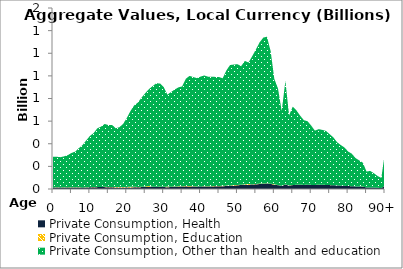
| Category | Private Consumption, Health | Private Consumption, Education | Private Consumption, Other than health and education |
|---|---|---|---|
| 0 | 12.96 | 0.914 | 270.473 |
|  | 13.577 | 1.798 | 269.697 |
| 2 | 13.556 | 0.538 | 267.21 |
| 3 | 13.371 | 1.679 | 273.608 |
| 4 | 13.487 | 0.735 | 284.792 |
| 5 | 13.558 | 2.582 | 302.59 |
| 6 | 12.843 | 2.132 | 314.75 |
| 7 | 12.6 | 2.602 | 345.778 |
| 8 | 12.729 | 1.166 | 374.715 |
| 9 | 13.536 | 1.827 | 414.327 |
| 10 | 14.559 | 1.907 | 452.532 |
| 11 | 15.206 | 2.021 | 476.493 |
| 12 | 16.601 | 1.332 | 518.052 |
| 13 | 16.738 | 1.366 | 533.222 |
| 14 | 16.603 | 2.892 | 555.227 |
| 15 | 15.306 | 2.948 | 547.471 |
| 16 | 14.785 | 2.63 | 549.216 |
| 17 | 13.961 | 3.948 | 519.25 |
| 18 | 14.046 | 3.361 | 528.91 |
| 19 | 14.139 | 3.154 | 557.708 |
| 20 | 14.38 | 3.805 | 609.4 |
| 21 | 14.191 | 6.527 | 668.637 |
| 22 | 14.463 | 6.104 | 718.41 |
| 23 | 15.425 | 2.365 | 746.221 |
| 24 | 16.786 | 2.749 | 788.069 |
| 25 | 17.82 | 3.941 | 825.337 |
| 26 | 18.878 | 7.571 | 856.589 |
| 27 | 19.287 | 1.64 | 888.43 |
| 28 | 19.029 | 1.114 | 914.332 |
| 29 | 18.524 | 2.566 | 911.9 |
| 30 | 17.237 | 1.606 | 883.562 |
| 31 | 15.577 | 6.301 | 812.54 |
| 32 | 17.443 | 2.573 | 837.196 |
| 33 | 19.247 | 2.969 | 857.588 |
| 34 | 20.611 | 2.78 | 875.098 |
| 35 | 21.821 | 1.416 | 883.327 |
| 36 | 23.428 | 3.534 | 947.238 |
| 37 | 22.723 | 4.019 | 972.993 |
| 38 | 21.323 | 3.094 | 965.709 |
| 39 | 20.844 | 1.77 | 956.912 |
| 40 | 21.411 | 1.394 | 970.886 |
| 41 | 21.512 | 2.293 | 979.526 |
| 42 | 21.516 | 2.984 | 968.787 |
| 43 | 22.234 | 2.486 | 967.424 |
| 44 | 23.815 | 3.011 | 964.127 |
| 45 | 24.228 | 3.16 | 962.175 |
| 46 | 24.403 | 3.54 | 950.982 |
| 47 | 26.469 | 3.486 | 1018.573 |
| 48 | 28.03 | 1.659 | 1066.267 |
| 49 | 29.473 | 6.562 | 1064.096 |
| 50 | 33.033 | 2.912 | 1067.275 |
| 51 | 35.515 | 2.07 | 1048.29 |
| 52 | 38.088 | 4.446 | 1089.512 |
| 53 | 38.013 | 6.141 | 1074.314 |
| 54 | 39.851 | 1.808 | 1132.289 |
| 55 | 41.29 | 3.13 | 1188.919 |
| 56 | 43.89 | 3.87 | 1248.269 |
| 57 | 46.658 | 1.773 | 1289.668 |
| 58 | 48.042 | 2.061 | 1296.046 |
| 59 | 45.494 | 1.577 | 1171.919 |
| 60 | 36.68 | 5.515 | 930.275 |
| 61 | 33.814 | 1.093 | 852.705 |
| 62 | 26.981 | 0.396 | 661.532 |
| 63 | 39.217 | 1.675 | 914.107 |
| 64 | 28.911 | 1.789 | 620.669 |
| 65 | 34.766 | 1.081 | 692.886 |
| 66 | 35.905 | 0.807 | 657.513 |
| 67 | 35.946 | 1.193 | 611.27 |
| 68 | 35.606 | 0.601 | 572.38 |
| 69 | 36.799 | 0.61 | 561.769 |
| 70 | 35.983 | 0.439 | 523.741 |
| 71 | 34.539 | 1.32 | 480.085 |
| 72 | 36.394 | 1.074 | 491.25 |
| 73 | 36.544 | 0.331 | 485.965 |
| 74 | 35.941 | 0.329 | 476.848 |
| 75 | 34.32 | 0.294 | 450.159 |
| 76 | 33.176 | 0.088 | 423.438 |
| 77 | 30.944 | 0.046 | 383.012 |
| 78 | 29.548 | 0.03 | 359.542 |
| 79 | 28.404 | 0.064 | 339.173 |
| 80 | 25.975 | 0.252 | 305.257 |
| 81 | 24.839 | 0.048 | 286.931 |
| 82 | 22.497 | 0.148 | 251.176 |
| 83 | 21.823 | 0.006 | 231.299 |
| 84 | 20.456 | 0.589 | 211.176 |
| 85 | 13.79 | 0 | 140.4 |
| 86 | 14.392 | 0.003 | 145.494 |
| 87 | 12.592 | 0 | 126.56 |
| 88 | 10.462 | 0.015 | 104.293 |
| 89 | 8.959 | 0 | 89.39 |
| 90+ | 29.511 | 0 | 295.807 |